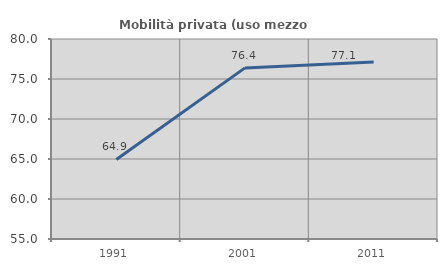
| Category | Mobilità privata (uso mezzo privato) |
|---|---|
| 1991.0 | 64.942 |
| 2001.0 | 76.389 |
| 2011.0 | 77.121 |